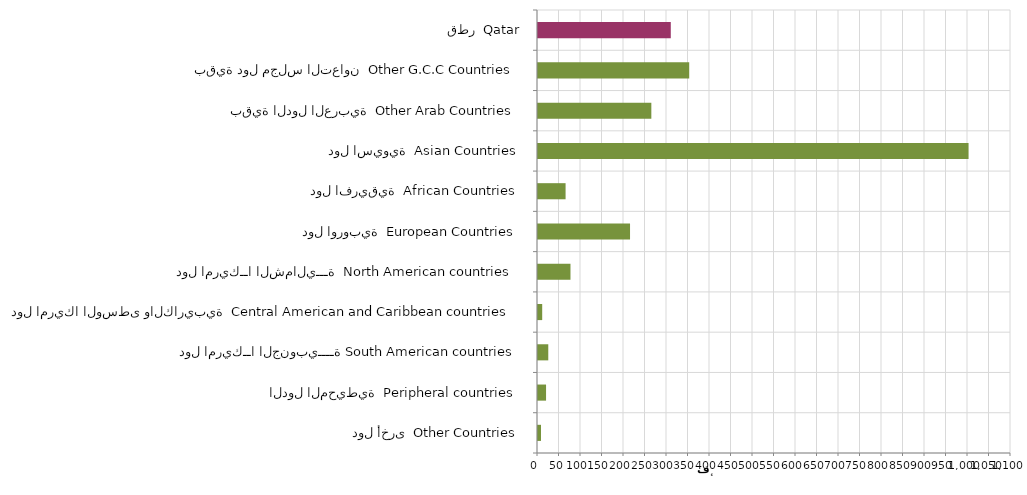
| Category | Series 0 |
|---|---|
| دول أخرى  Other Countries | 6980 |
| الدول المحيطية  Peripheral countries | 18734 |
| دول امريكــا الجنوبيــــة South American countries | 23899 |
| دول امريكا الوسطى والكاريبية  Central American and Caribbean countries | 9760 |
| دول امريكــا الشماليـــة  North American countries  | 75535 |
| دول اوروبية  European Countries | 214039 |
| دول افريقية  African Countries | 64135 |
| دول اسيوية  Asian Countries | 1001321 |
| بقية الدول العربية  Other Arab Countries | 263579 |
| بقية دول مجلس التعاون  Other G.C.C Countries | 351664 |
| قطر  Qatar | 308802 |